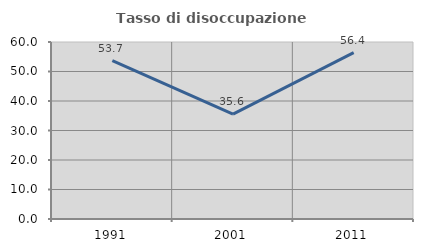
| Category | Tasso di disoccupazione giovanile  |
|---|---|
| 1991.0 | 53.659 |
| 2001.0 | 35.556 |
| 2011.0 | 56.41 |